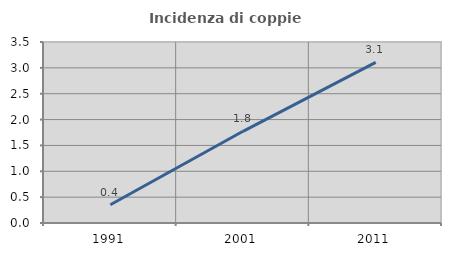
| Category | Incidenza di coppie miste |
|---|---|
| 1991.0 | 0.353 |
| 2001.0 | 1.773 |
| 2011.0 | 3.106 |